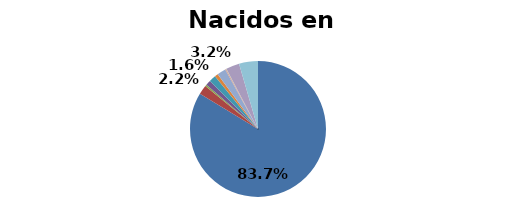
| Category | Nacidos en Argentina |
|---|---|
| Mapuche | 0.837 |
| Aymara | 0.022 |
| Rapa Nui | 0.004 |
| Lican Antai | 0.012 |
| Quechua | 0.016 |
| Colla | 0.008 |
| Diaguita | 0.021 |
| Kawésqar | 0.002 |
| Yagán o Yámana | 0.001 |
| Otro | 0.032 |
| Pueblo ignorado | 0.045 |